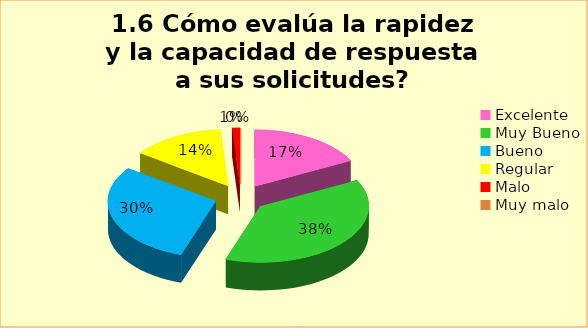
| Category | Series 0 |
|---|---|
| Excelente | 0.174 |
| Muy Bueno | 0.378 |
| Bueno  | 0.297 |
| Regular  | 0.14 |
| Malo  | 0.012 |
| Muy malo  | 0 |